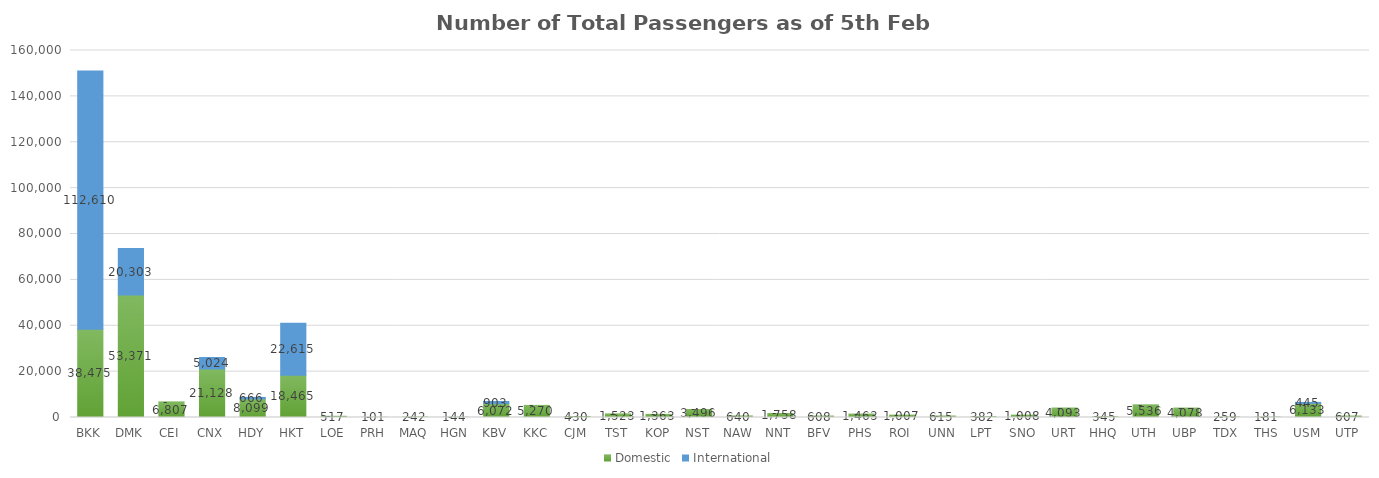
| Category | Domestic | International |
|---|---|---|
| BKK | 38475 | 112610 |
| DMK | 53371 | 20303 |
| CEI | 6807 | 0 |
| CNX | 21128 | 5024 |
| HDY | 8099 | 666 |
| HKT | 18465 | 22615 |
| LOE | 517 | 0 |
| PRH | 101 | 0 |
| MAQ | 242 | 0 |
| HGN | 144 | 0 |
| KBV | 6072 | 903 |
| KKC | 5270 | 0 |
| CJM | 430 | 0 |
| TST | 1523 | 0 |
| KOP | 1363 | 0 |
| NST | 3496 | 0 |
| NAW | 640 | 0 |
| NNT | 1758 | 0 |
| BFV | 608 | 0 |
| PHS | 1463 | 0 |
| ROI | 1007 | 0 |
| UNN | 615 | 0 |
| LPT | 382 | 0 |
| SNO | 1008 | 0 |
| URT | 4093 | 0 |
| HHQ | 345 | 0 |
| UTH | 5536 | 0 |
| UBP | 4078 | 0 |
| TDX | 259 | 0 |
| THS | 181 | 0 |
| USM | 6133 | 445 |
| UTP | 607 | 0 |